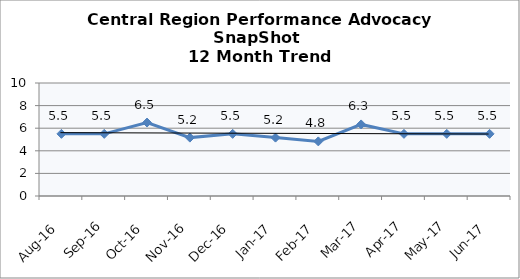
| Category | Central Region |
|---|---|
| Aug-16 | 5.5 |
| Sep-16 | 5.5 |
| Oct-16 | 6.5 |
| Nov-16 | 5.167 |
| Dec-16 | 5.5 |
| Jan-17 | 5.167 |
| Feb-17 | 4.833 |
| Mar-17 | 6.333 |
| Apr-17 | 5.5 |
| May-17 | 5.5 |
| Jun-17 | 5.5 |